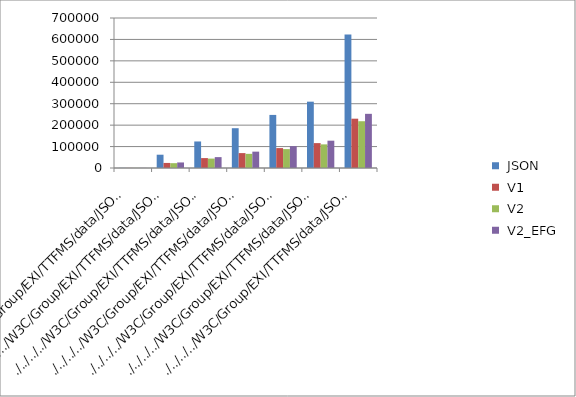
| Category |  JSON |  V1 |  V2 |  V2_EFG |
|---|---|---|---|---|
| ./../../../W3C/Group/EXI/TTFMS/data/JSON/openweathermap.org/sample-set-1/owm-1-1cities.json | 615 | 424 | 480 | 447 |
| ./../../../W3C/Group/EXI/TTFMS/data/JSON/openweathermap.org/sample-set-1/owm-1-100cities.json | 62024 | 23636 | 22514 | 25904 |
| ./../../../W3C/Group/EXI/TTFMS/data/JSON/openweathermap.org/sample-set-1/owm-1-200cities.json | 123811 | 46236 | 43918 | 50770 |
| ./../../../W3C/Group/EXI/TTFMS/data/JSON/openweathermap.org/sample-set-1/owm-1-300cities.json | 185699 | 69527 | 66019 | 76328 |
| ./../../../W3C/Group/EXI/TTFMS/data/JSON/openweathermap.org/sample-set-1/owm-1-400cities.json | 247718 | 92884 | 88186 | 101954 |
| ./../../../W3C/Group/EXI/TTFMS/data/JSON/openweathermap.org/sample-set-1/owm-1-500cities.json | 309532 | 116142 | 110261 | 127471 |
| ./../../../W3C/Group/EXI/TTFMS/data/JSON/openweathermap.org/sample-set-1/owm-1-1000cities.json | 622540 | 230097 | 218262 | 252797 |